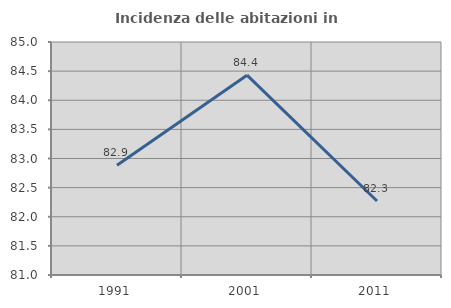
| Category | Incidenza delle abitazioni in proprietà  |
|---|---|
| 1991.0 | 82.883 |
| 2001.0 | 84.43 |
| 2011.0 | 82.27 |